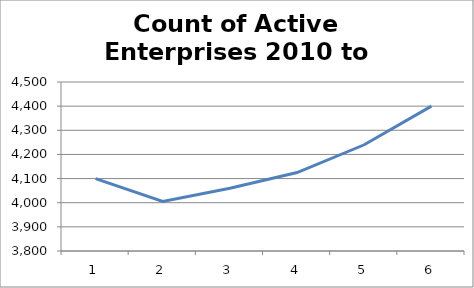
| Category | Series 0 |
|---|---|
| 0 | 4100 |
| 1 | 4005 |
| 2 | 4060 |
| 3 | 4125 |
| 4 | 4240 |
| 5 | 4400 |